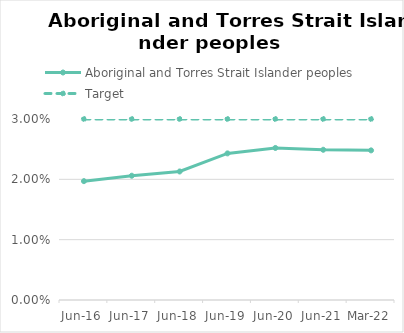
| Category | Aboriginal and Torres Strait Islander peoples | Target |
|---|---|---|
| 2016-06-01 | 0.02 | 0.03 |
| 2017-06-01 | 0.021 | 0.03 |
| 2018-06-01 | 0.021 | 0.03 |
| 2019-06-01 | 0.024 | 0.03 |
| 2020-06-01 | 0.025 | 0.03 |
| 2021-06-01 | 0.025 | 0.03 |
| 2022-03-01 | 0.025 | 0.03 |